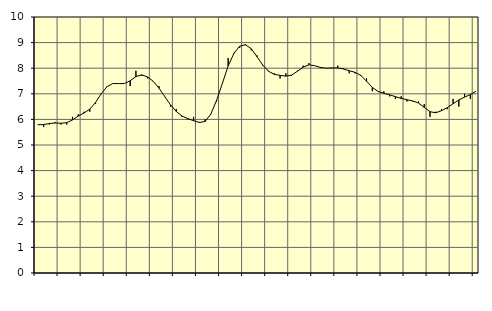
| Category | Piggar | Series 1 |
|---|---|---|
| nan | 5.8 | 5.79 |
| 1.0 | 5.7 | 5.8 |
| 1.0 | 5.8 | 5.84 |
| 1.0 | 5.9 | 5.86 |
| nan | 5.8 | 5.85 |
| 2.0 | 5.8 | 5.87 |
| 2.0 | 6.1 | 5.98 |
| 2.0 | 6.2 | 6.13 |
| nan | 6.3 | 6.25 |
| 3.0 | 6.3 | 6.4 |
| 3.0 | 6.6 | 6.66 |
| 3.0 | 7 | 7.01 |
| nan | 7.3 | 7.28 |
| 4.0 | 7.4 | 7.4 |
| 4.0 | 7.4 | 7.4 |
| 4.0 | 7.4 | 7.4 |
| nan | 7.3 | 7.51 |
| 5.0 | 7.9 | 7.67 |
| 5.0 | 7.7 | 7.74 |
| 5.0 | 7.6 | 7.66 |
| nan | 7.5 | 7.49 |
| 6.0 | 7.3 | 7.22 |
| 6.0 | 6.9 | 6.89 |
| 6.0 | 6.5 | 6.57 |
| nan | 6.4 | 6.31 |
| 7.0 | 6.1 | 6.13 |
| 7.0 | 6 | 6.03 |
| 7.0 | 6.1 | 5.95 |
| nan | 5.9 | 5.88 |
| 8.0 | 6 | 5.92 |
| 8.0 | 6.2 | 6.21 |
| 8.0 | 6.7 | 6.75 |
| nan | 7.4 | 7.41 |
| 9.0 | 8.4 | 8.09 |
| 9.0 | 8.6 | 8.58 |
| 9.0 | 8.8 | 8.86 |
| nan | 8.9 | 8.92 |
| 10.0 | 8.7 | 8.76 |
| 10.0 | 8.5 | 8.45 |
| 10.0 | 8.1 | 8.12 |
| nan | 7.9 | 7.88 |
| 11.0 | 7.8 | 7.76 |
| 11.0 | 7.6 | 7.72 |
| 11.0 | 7.8 | 7.69 |
| nan | 7.7 | 7.73 |
| 12.0 | 7.9 | 7.88 |
| 12.0 | 8.1 | 8.04 |
| 12.0 | 8.2 | 8.13 |
| nan | 8.1 | 8.1 |
| 13.0 | 8 | 8.03 |
| 13.0 | 8 | 8 |
| 13.0 | 8 | 8.01 |
| nan | 8.1 | 8.01 |
| 14.0 | 8 | 7.97 |
| 14.0 | 7.8 | 7.9 |
| 14.0 | 7.8 | 7.84 |
| nan | 7.7 | 7.72 |
| 15.0 | 7.6 | 7.49 |
| 15.0 | 7.1 | 7.25 |
| 15.0 | 7.1 | 7.09 |
| nan | 7.1 | 7.02 |
| 16.0 | 6.9 | 6.96 |
| 16.0 | 6.8 | 6.89 |
| 16.0 | 6.9 | 6.82 |
| nan | 6.7 | 6.77 |
| 17.0 | 6.7 | 6.72 |
| 17.0 | 6.7 | 6.64 |
| 17.0 | 6.6 | 6.47 |
| nan | 6.1 | 6.3 |
| 18.0 | 6.3 | 6.26 |
| 18.0 | 6.4 | 6.34 |
| 18.0 | 6.4 | 6.46 |
| nan | 6.8 | 6.61 |
| 19.0 | 6.5 | 6.76 |
| 19.0 | 7 | 6.87 |
| 19.0 | 6.8 | 6.97 |
| nan | 7.1 | 7.1 |